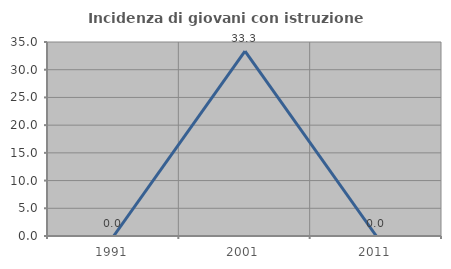
| Category | Incidenza di giovani con istruzione universitaria |
|---|---|
| 1991.0 | 0 |
| 2001.0 | 33.333 |
| 2011.0 | 0 |